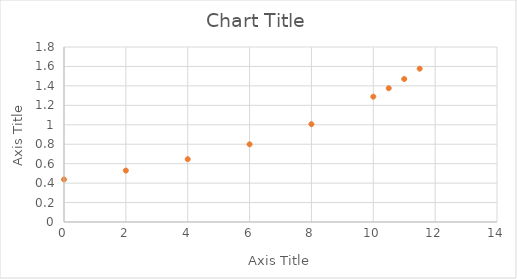
| Category | Series 1 |
|---|---|
| 0.0 | 0.438 |
| 2.0 | 0.529 |
| 4.0 | 0.646 |
| 6.0 | 0.799 |
| 8.0 | 1.006 |
| 10.0 | 1.289 |
| 10.5 | 1.376 |
| 11.0 | 1.471 |
| 11.5 | 1.577 |